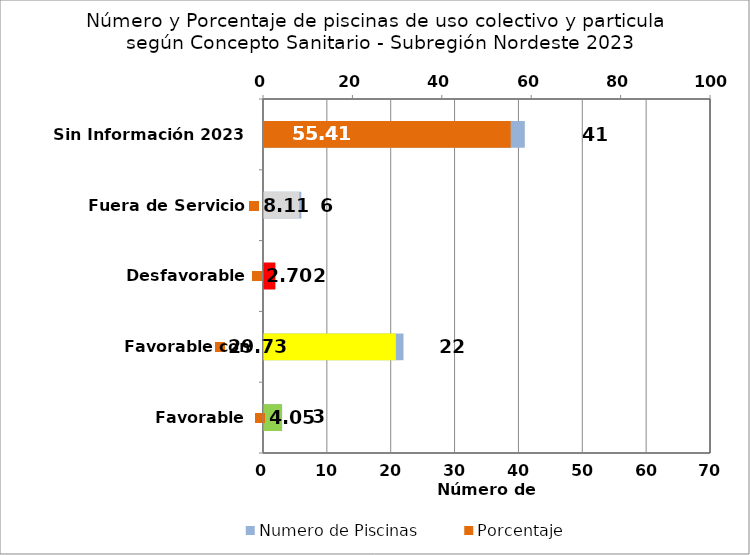
| Category | Numero de Piscinas |
|---|---|
| Favorable | 3 |
| Favorable con Requerimientos | 22 |
| Desfavorable | 2 |
| Fuera de Servicio | 6 |
| Sin Información 2023 | 41 |